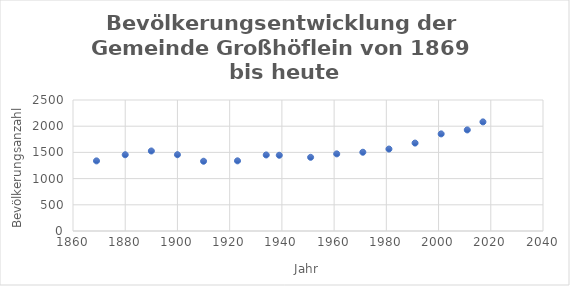
| Category | Bevölkerungsanzahl |
|---|---|
| 1869.0 | 1338 |
| 1880.0 | 1455 |
| 1890.0 | 1527 |
| 1900.0 | 1456 |
| 1910.0 | 1331 |
| 1923.0 | 1339 |
| 1934.0 | 1451 |
| 1939.0 | 1445 |
| 1951.0 | 1406 |
| 1961.0 | 1472 |
| 1971.0 | 1503 |
| 1981.0 | 1564 |
| 1991.0 | 1678 |
| 2001.0 | 1853 |
| 2011.0 | 1929 |
| 2017.0 | 2082 |